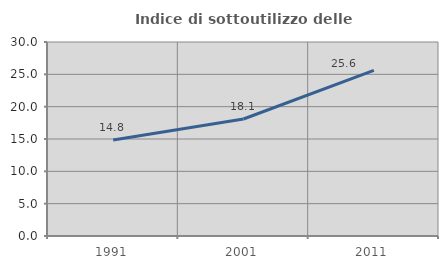
| Category | Indice di sottoutilizzo delle abitazioni  |
|---|---|
| 1991.0 | 14.841 |
| 2001.0 | 18.095 |
| 2011.0 | 25.614 |